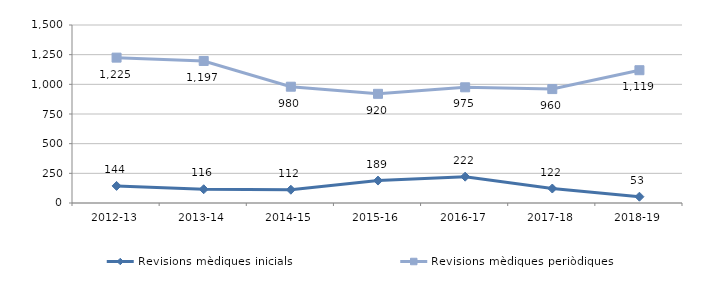
| Category | Revisions mèdiques inicials | Revisions mèdiques periòdiques |
|---|---|---|
| 2012-13 | 144 | 1225 |
| 2013-14 | 116 | 1197 |
| 2014-15 | 112 | 980 |
| 2015-16 | 189 | 920 |
| 2016-17 | 222 | 975 |
| 2017-18 | 122 | 960 |
| 2018-19 | 53 | 1119 |